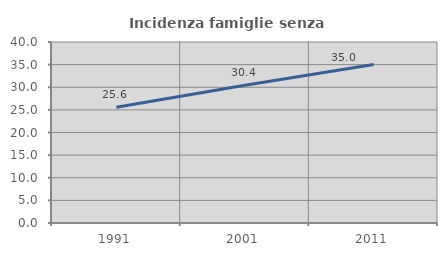
| Category | Incidenza famiglie senza nuclei |
|---|---|
| 1991.0 | 25.603 |
| 2001.0 | 30.427 |
| 2011.0 | 35.02 |